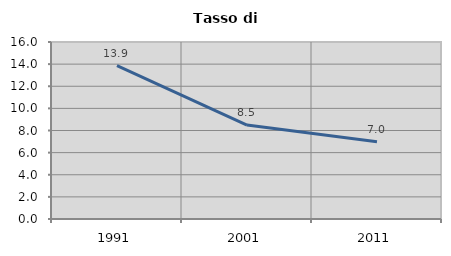
| Category | Tasso di disoccupazione   |
|---|---|
| 1991.0 | 13.867 |
| 2001.0 | 8.491 |
| 2011.0 | 6.99 |